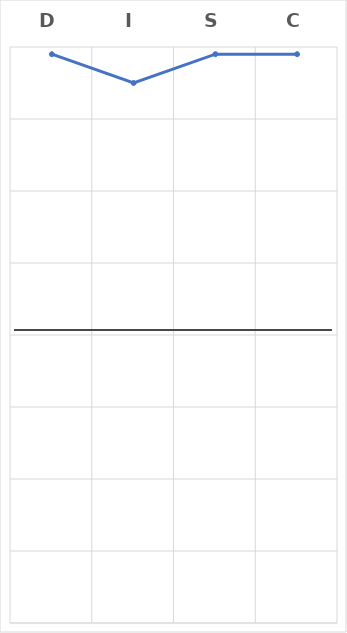
| Category | Series 0 |
|---|---|
| D | 7.9 |
| I | 7.5 |
| S | 7.9 |
| C | 7.9 |